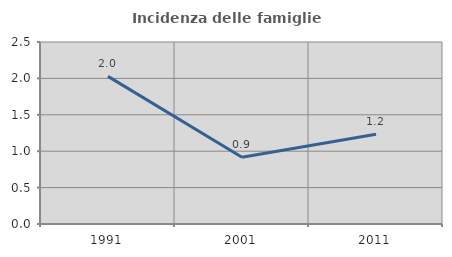
| Category | Incidenza delle famiglie numerose |
|---|---|
| 1991.0 | 2.028 |
| 2001.0 | 0.918 |
| 2011.0 | 1.233 |